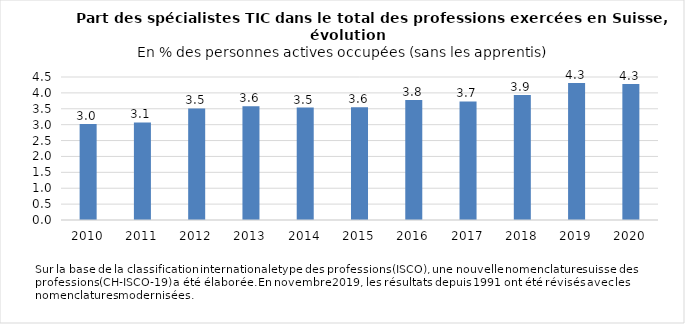
| Category | %  |
|---|---|
| 2010.0 | 3.02 |
| 2011.0 | 3.07 |
| 2012.0 | 3.51 |
| 2013.0 | 3.58 |
| 2014.0 | 3.54 |
| 2015.0 | 3.55 |
| 2016.0 | 3.78 |
| 2017.0 | 3.73 |
| 2018.0 | 3.93 |
| 2019.0 | 4.31 |
| 2020.0 | 4.283 |